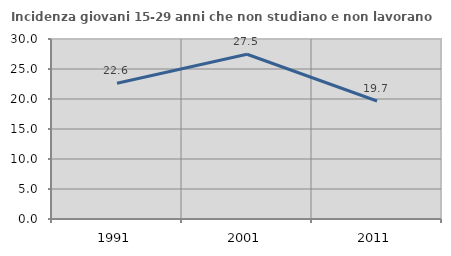
| Category | Incidenza giovani 15-29 anni che non studiano e non lavorano  |
|---|---|
| 1991.0 | 22.619 |
| 2001.0 | 27.457 |
| 2011.0 | 19.666 |